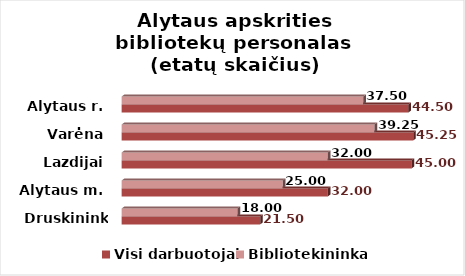
| Category | Visi darbuotojai | Bibliotekininkai |
|---|---|---|
| Druskininkai | 21.5 | 18 |
| Alytaus m. | 32 | 25 |
| Lazdijai | 45 | 32 |
| Varėna | 45.25 | 39.25 |
| Alytaus r. | 44.5 | 37.5 |